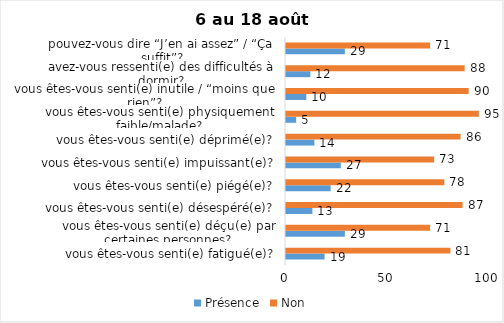
| Category | Présence | Non |
|---|---|---|
| vous êtes-vous senti(e) fatigué(e)? | 19 | 81 |
| vous êtes-vous senti(e) déçu(e) par certaines personnes? | 29 | 71 |
| vous êtes-vous senti(e) désespéré(e)? | 13 | 87 |
| vous êtes-vous senti(e) piégé(e)? | 22 | 78 |
| vous êtes-vous senti(e) impuissant(e)? | 27 | 73 |
| vous êtes-vous senti(e) déprimé(e)? | 14 | 86 |
| vous êtes-vous senti(e) physiquement faible/malade? | 5 | 95 |
| vous êtes-vous senti(e) inutile / “moins que rien”? | 10 | 90 |
| avez-vous ressenti(e) des difficultés à dormir? | 12 | 88 |
| pouvez-vous dire “J’en ai assez” / “Ça suffit”? | 29 | 71 |